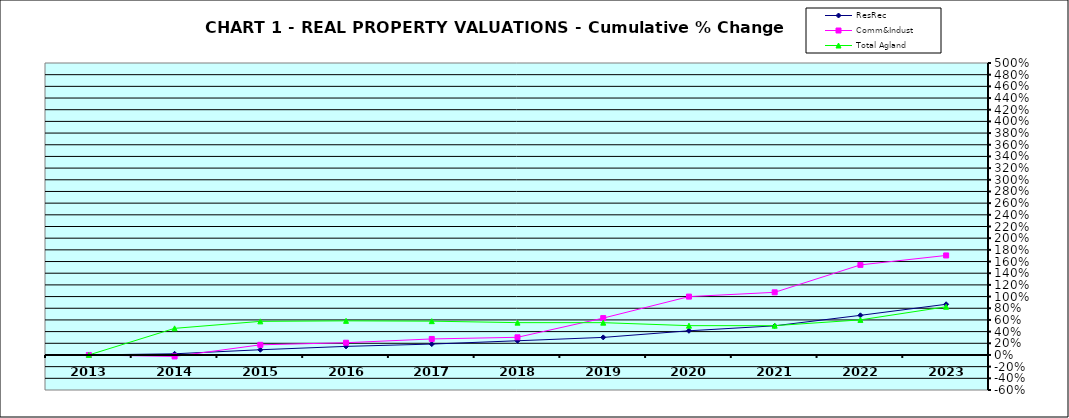
| Category | ResRec | Comm&Indust | Total Agland |
|---|---|---|---|
| 2013.0 | 0 | 0 | 0 |
| 2014.0 | 0.02 | -0.025 | 0.456 |
| 2015.0 | 0.089 | 0.174 | 0.575 |
| 2016.0 | 0.147 | 0.21 | 0.584 |
| 2017.0 | 0.187 | 0.274 | 0.579 |
| 2018.0 | 0.243 | 0.303 | 0.554 |
| 2019.0 | 0.301 | 0.631 | 0.553 |
| 2020.0 | 0.414 | 1 | 0.502 |
| 2021.0 | 0.499 | 1.073 | 0.502 |
| 2022.0 | 0.679 | 1.542 | 0.601 |
| 2023.0 | 0.868 | 1.704 | 0.825 |